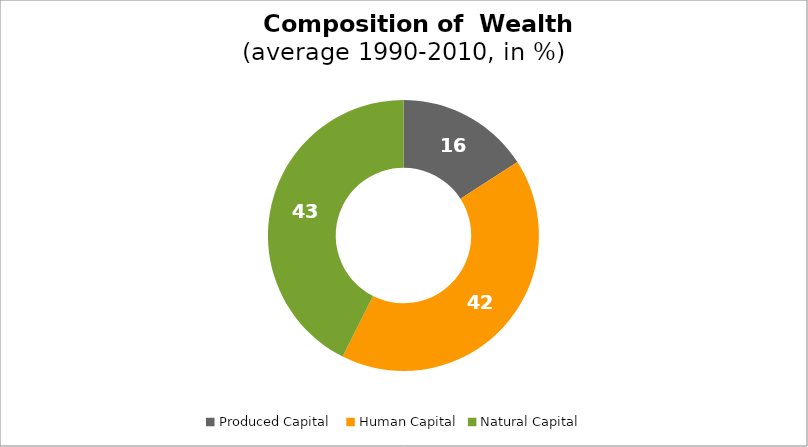
| Category | Series 0 |
|---|---|
| Produced Capital  | 15.891 |
| Human Capital | 41.528 |
| Natural Capital | 42.581 |